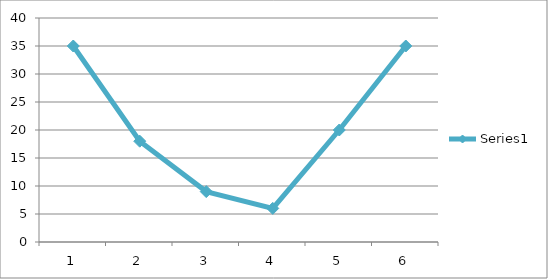
| Category | Series 0 |
|---|---|
| 0 | 35 |
| 1 | 18 |
| 2 | 9 |
| 3 | 6 |
| 4 | 20 |
| 5 | 35 |